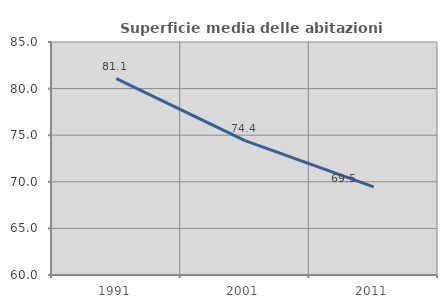
| Category | Superficie media delle abitazioni occupate |
|---|---|
| 1991.0 | 81.06 |
| 2001.0 | 74.419 |
| 2011.0 | 69.453 |